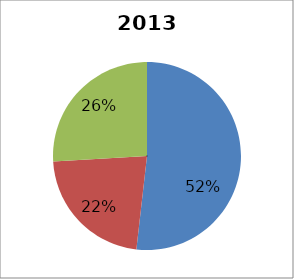
| Category | 2013 Breakdown |
|---|---|
| 0 | 0.518 |
| 1 | 0.223 |
| 2 | 0.259 |